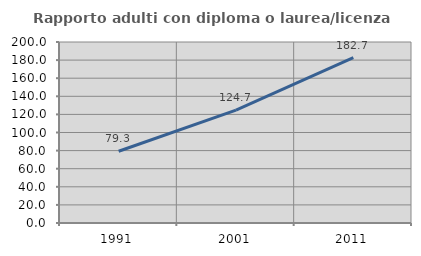
| Category | Rapporto adulti con diploma o laurea/licenza media  |
|---|---|
| 1991.0 | 79.278 |
| 2001.0 | 124.729 |
| 2011.0 | 182.706 |